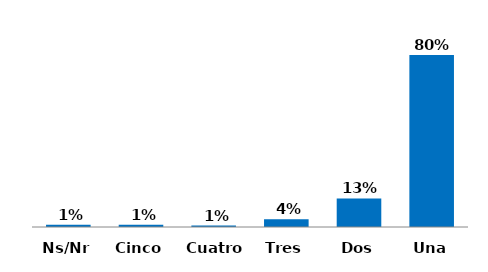
| Category | Series 0 |
|---|---|
| Una | 0.803 |
| Dos | 0.133 |
| Tres | 0.037 |
| Cuatro | 0.007 |
| Cinco | 0.01 |
| Ns/Nr | 0.01 |